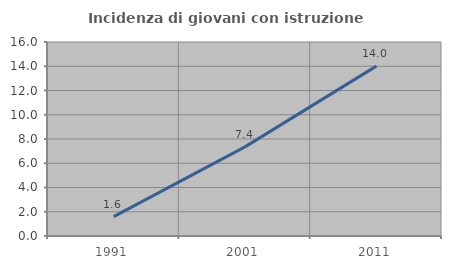
| Category | Incidenza di giovani con istruzione universitaria |
|---|---|
| 1991.0 | 1.6 |
| 2001.0 | 7.35 |
| 2011.0 | 14.011 |